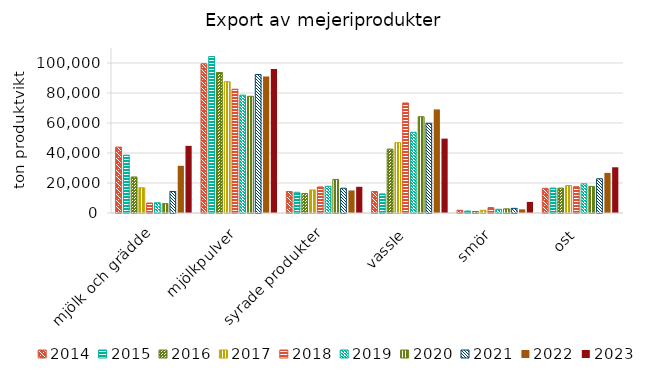
| Category | 2014 | 2015 | 2016 | 2017 | 2018 | 2019 | 2020 | 2021 | 2022 | 2023 |
|---|---|---|---|---|---|---|---|---|---|---|
| mjölk och grädde | 43936 | 38544 | 24029 | 16807 | 6660 | 6829 | 6227 | 14374 | 31456 | 44761 |
| mjölkpulver | 99483 | 104295 | 93686 | 87540 | 82535 | 78587 | 77786 | 92336 | 90987 | 96063 |
| syrade produkter | 14320 | 13818 | 13025 | 15356 | 17355 | 17822 | 22397 | 16505 | 15033 | 17471 |
| vassle | 14348 | 12728 | 42593 | 46875 | 73362 | 53849 | 64180 | 59806 | 69045 | 49583 |
| smör | 1834 | 1308 | 1022 | 1814 | 3621 | 2480 | 2790 | 3095 | 2426 | 7383 |
| ost | 16464 | 16623 | 16592 | 18292 | 17545 | 19431 | 17729 | 22824 | 26747 | 30484 |